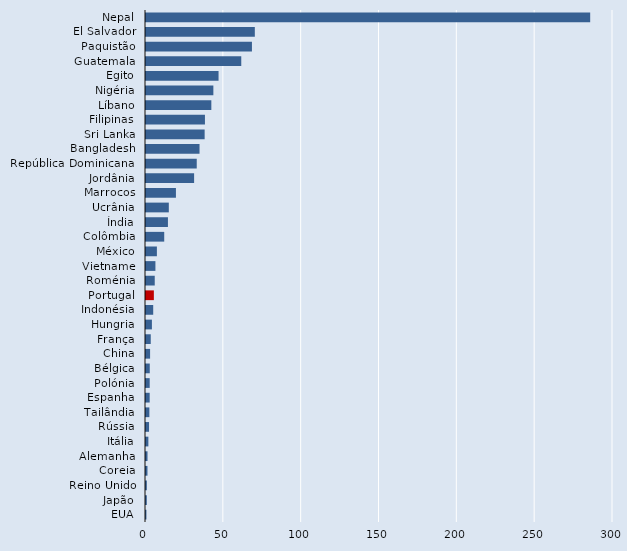
| Category | Series 2 |
|---|---|
| Nepal | 285.345 |
| El Salvador | 69.906 |
| Paquistão | 68.055 |
| Guatemala | 61.199 |
| Egito | 46.607 |
| Nigéria | 43.273 |
| Líbano | 41.976 |
| Filipinas | 37.864 |
| Sri Lanka | 37.674 |
| Bangladesh | 34.387 |
| República Dominicana  | 32.596 |
| Jordânia | 30.904 |
| Marrocos | 19.227 |
| Ucrânia | 14.655 |
| Índia | 14.092 |
| Colômbia | 11.709 |
| México | 6.995 |
| Vietname | 6.051 |
| Roménia | 5.618 |
| Portugal | 5.044 |
| Indonésia | 4.633 |
| Hungria | 3.796 |
| França | 3.052 |
| China | 2.629 |
| Bélgica | 2.42 |
| Polónia | 2.373 |
| Espanha | 2.361 |
| Tailândia | 2.165 |
| Rússia | 1.954 |
| Itália | 1.525 |
| Alemanha | 0.969 |
| Coreia | 0.945 |
| Reino Unido | 0.55 |
| Japão | 0.523 |
| EUA | 0.281 |